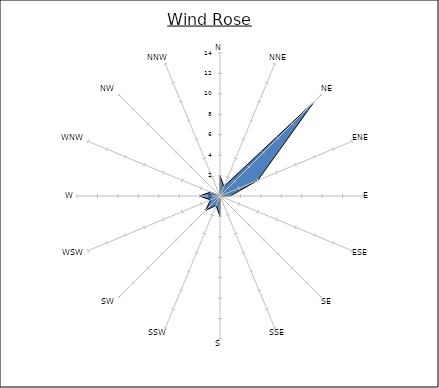
| Category | Series 0 |
|---|---|
| N | 2 |
| NNE | 1 |
| NE | 13 |
| ENE | 4 |
| E | 1 |
| ESE | 0 |
| SE | 1 |
| SSE | 0 |
| S | 2 |
| SSW | 1 |
| SW | 2 |
| WSW | 1 |
| W | 2 |
| WNW | 1 |
| NW | 0 |
| NNW | 0 |